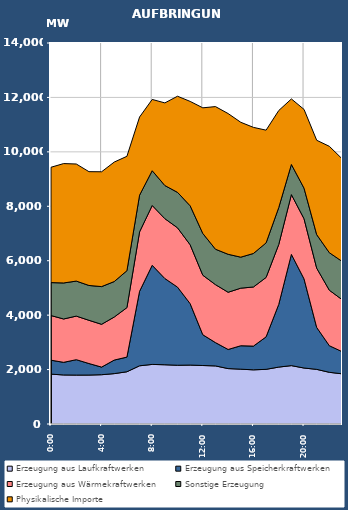
| Category | Erzeugung aus Laufkraftwerken | Erzeugung aus Speicherkraftwerken | Erzeugung aus Wärmekraftwerken | Sonstige Erzeugung | Physikalische Importe |
|---|---|---|---|---|---|
| 2007-01-17 | 1832.605 | 511.867 | 1640.729 | 1210.68 | 4238.014 |
| 2007-01-17 01:00:00 | 1802.123 | 463.879 | 1593.137 | 1323.498 | 4386.93 |
| 2007-01-17 02:00:00 | 1797.282 | 565.921 | 1601.661 | 1286.629 | 4301.826 |
| 2007-01-17 03:00:00 | 1798.556 | 423.605 | 1588.821 | 1279.703 | 4181.638 |
| 2007-01-17 04:00:00 | 1810.968 | 279.819 | 1572.659 | 1385.596 | 4219.218 |
| 2007-01-17 05:00:00 | 1851.274 | 497.925 | 1582.198 | 1303.405 | 4390.398 |
| 2007-01-17 06:00:00 | 1919.86 | 538.395 | 1817.713 | 1356.852 | 4203.626 |
| 2007-01-17 07:00:00 | 2138.794 | 2737.805 | 2182.767 | 1349.299 | 2871.118 |
| 2007-01-17 08:00:00 | 2189.553 | 3641.665 | 2198.389 | 1277.754 | 2618.462 |
| 2007-01-17 09:00:00 | 2176.843 | 3169.309 | 2199.198 | 1217.306 | 3036.182 |
| 2007-01-17 10:00:00 | 2158.545 | 2870.415 | 2180.794 | 1301.736 | 3532.434 |
| 2007-01-17 11:00:00 | 2165.341 | 2255.2 | 2163.846 | 1433.415 | 3835.735 |
| 2007-01-17 12:00:00 | 2149.607 | 1129.911 | 2187.987 | 1533.614 | 4617.269 |
| 2007-01-17 13:00:00 | 2134.655 | 856.315 | 2130.328 | 1301.159 | 5241.131 |
| 2007-01-17 14:00:00 | 2036.109 | 702.503 | 2102.491 | 1394.804 | 5171.598 |
| 2007-01-17 15:00:00 | 2014.312 | 861.525 | 2115.538 | 1138.84 | 4956.092 |
| 2007-01-17 16:00:00 | 1990.31 | 871.585 | 2173.029 | 1230.843 | 4634.068 |
| 2007-01-17 17:00:00 | 2008.856 | 1193.107 | 2183.261 | 1269.54 | 4142.61 |
| 2007-01-17 18:00:00 | 2091.28 | 2303.467 | 2201.383 | 1356.579 | 3565.45 |
| 2007-01-17 19:00:00 | 2145.242 | 4087.405 | 2197.376 | 1107.103 | 2407.494 |
| 2007-01-17 20:00:00 | 2056.97 | 3274.969 | 2210.539 | 1123.402 | 2893.978 |
| 2007-01-17 21:00:00 | 2007.403 | 1540.477 | 2179.314 | 1231.604 | 3467.614 |
| 2007-01-17 22:00:00 | 1899.731 | 976.796 | 2039.634 | 1378.066 | 3909.03 |
| 2007-01-17 23:00:00 | 1843.651 | 816.636 | 1912.352 | 1405.256 | 3771.074 |